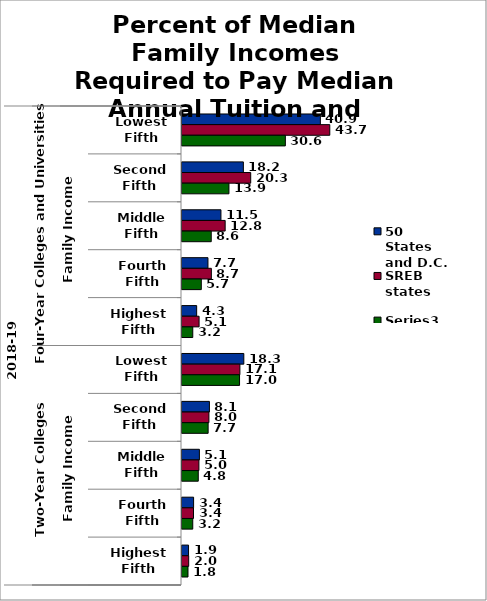
| Category | 50 States and D.C. | SREB states | Series 2 |
|---|---|---|---|
| 0 | 40.936 | 43.724 | 30.579 |
| 1 | 18.156 | 20.329 | 13.887 |
| 2 | 11.522 | 12.772 | 8.65 |
| 3 | 7.68 | 8.688 | 5.712 |
| 4 | 4.339 | 5.054 | 3.187 |
| 5 | 18.289 | 17.13 | 17.029 |
| 6 | 8.111 | 7.965 | 7.734 |
| 7 | 5.148 | 5.004 | 4.817 |
| 8 | 3.431 | 3.404 | 3.181 |
| 9 | 1.939 | 1.98 | 1.775 |